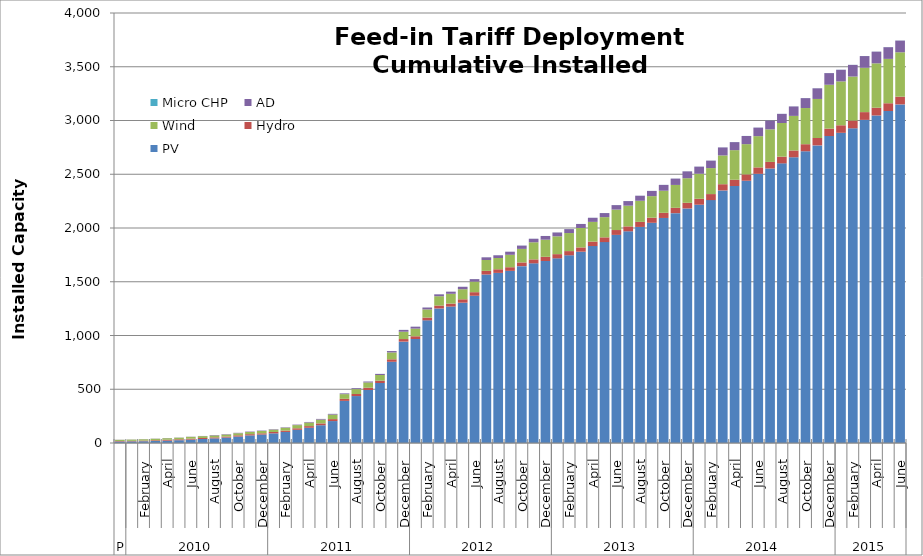
| Category | PV | Hydro | Wind | AD | Micro CHP |
|---|---|---|---|---|---|
| 0 | 13.818 | 4.716 | 11.07 | 1.103 | 0 |
| 1 | 14.999 | 4.764 | 12.022 | 1.103 | 0 |
| 2 | 16.38 | 5.951 | 12.403 | 1.103 | 0 |
| 3 | 18.9 | 6.692 | 14.044 | 1.463 | 0 |
| 4 | 21.54 | 8.692 | 14.314 | 1.463 | 0 |
| 5 | 25.843 | 8.692 | 14.997 | 1.463 | 0 |
| 6 | 31.411 | 9.187 | 16.425 | 1.633 | 0.006 |
| 7 | 37.313 | 9.252 | 17.16 | 1.721 | 0.016 |
| 8 | 43.105 | 9.352 | 17.742 | 3.851 | 0.025 |
| 9 | 50.635 | 9.406 | 18.373 | 3.851 | 0.038 |
| 10 | 60.092 | 11.453 | 19.317 | 3.851 | 0.055 |
| 11 | 70.674 | 11.489 | 20.153 | 3.851 | 0.091 |
| 12 | 78.702 | 11.497 | 21.505 | 3.851 | 0.124 |
| 13 | 89.897 | 12.367 | 22.097 | 4.041 | 0.151 |
| 14 | 102.824 | 12.382 | 26.717 | 4.041 | 0.193 |
| 15 | 122.628 | 14.307 | 29.386 | 4.73 | 0.238 |
| 16 | 141.79 | 15.41 | 33.253 | 5.23 | 0.264 |
| 17 | 165.306 | 17.138 | 35.089 | 6.529 | 0.291 |
| 18 | 204.071 | 18.175 | 41.792 | 6.889 | 0.31 |
| 19 | 391.847 | 19.17 | 43.551 | 6.889 | 0.33 |
| 20 | 436.595 | 19.438 | 45.368 | 8.554 | 0.355 |
| 21 | 493.002 | 21.286 | 49.002 | 8.554 | 0.396 |
| 22 | 558.275 | 21.818 | 52.463 | 10.124 | 0.426 |
| 23 | 755.359 | 23.449 | 63.705 | 12.954 | 0.442 |
| 24 | 942.978 | 24.02 | 68.263 | 16.719 | 0.454 |
| 25 | 967.404 | 25.529 | 71.275 | 17.718 | 0.459 |
| 26 | 1140.961 | 25.88 | 75.761 | 17.718 | 0.464 |
| 27 | 1251.739 | 27.131 | 86.458 | 17.718 | 0.474 |
| 28 | 1269.163 | 27.773 | 91.016 | 19.678 | 0.482 |
| 29 | 1305.184 | 31.753 | 93.499 | 22.633 | 0.497 |
| 30 | 1369.612 | 33.394 | 98.344 | 23.195 | 0.514 |
| 31 | 1567.412 | 33.811 | 101.005 | 25.097 | 0.52 |
| 32 | 1582.294 | 33.811 | 104.685 | 25.596 | 0.524 |
| 33 | 1601.155 | 34.054 | 115.48 | 28.581 | 0.534 |
| 34 | 1645.348 | 34.426 | 126.023 | 30.547 | 0.55 |
| 35 | 1671.279 | 36.851 | 158.956 | 32.925 | 0.566 |
| 36 | 1692.99 | 38.999 | 159.267 | 34.165 | 0.574 |
| 37 | 1717.715 | 39.049 | 165.792 | 35.863 | 0.586 |
| 38 | 1745.831 | 39.361 | 167.829 | 36.622 | 0.59 |
| 39 | 1779.487 | 39.93 | 180.917 | 37.121 | 0.594 |
| 40 | 1831.955 | 41.635 | 183.393 | 38 | 0.599 |
| 41 | 1868.834 | 44.316 | 187.839 | 38 | 0.599 |
| 42 | 1936.083 | 45.01 | 190.188 | 41.688 | 0.6 |
| 43 | 1969.257 | 45.862 | 192.502 | 42.991 | 0.602 |
| 44 | 2009.878 | 47.055 | 196.487 | 46.789 | 0.602 |
| 45 | 2048.457 | 47.527 | 200.515 | 48.285 | 0.602 |
| 46 | 2093.322 | 47.966 | 205.476 | 54.104 | 0.604 |
| 47 | 2138.244 | 49.52 | 212.79 | 59.022 | 0.609 |
| 48 | 2181.965 | 52.485 | 228.667 | 63.899 | 0.613 |
| 49 | 2216.546 | 55.317 | 232.777 | 66.277 | 0.618 |
| 50 | 2259.428 | 56.114 | 241.816 | 69.334 | 0.621 |
| 51 | 2349.365 | 57.977 | 267.658 | 74.578 | 0.628 |
| 52 | 2390.92 | 58.084 | 275.166 | 74.828 | 0.628 |
| 53 | 2439.673 | 59.209 | 281.241 | 75.826 | 0.628 |
| 54 | 2503.86 | 59.935 | 290.629 | 79.523 | 0.628 |
| 55 | 2553.648 | 61.031 | 303.18 | 81.621 | 0.63 |
| 56 | 2601.163 | 62.737 | 312.95 | 84.84 | 0.632 |
| 57 | 2658.015 | 63.236 | 321.659 | 87.984 | 0.634 |
| 58 | 2713.96 | 65.515 | 336.508 | 92.233 | 0.641 |
| 59 | 2768.464 | 68.737 | 363.223 | 99.198 | 0.644 |
| 60 | 2855.483 | 69.2 | 407.935 | 108.388 | 0.646 |
| 61 | 2885.475 | 70.076 | 408.16 | 108.388 | 0.658 |
| 62 | 2927.397 | 72.111 | 409.383 | 108.388 | 0.667 |
| 63 | 3005.847 | 72.115 | 412.697 | 108.888 | 0.668 |
| 64 | 3046.827 | 72.115 | 412.777 | 108.888 | 0.67 |
| 65 | 3088.342 | 72.115 | 412.779 | 108.888 | 0.67 |
| 66 | 3149.668 | 72.115 | 412.785 | 108.888 | 0.67 |